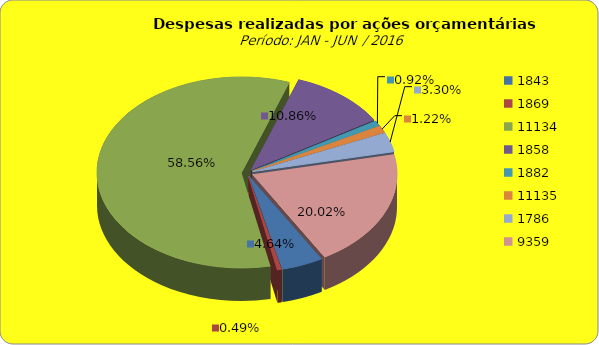
| Category | Series 1 |
|---|---|
| 1843.0 | 5874074.72 |
| 1869.0 | 616053.57 |
| 11134.0 | 74134536.41 |
| 1858.0 | 13753455.4 |
| 1882.0 | 1159155.3 |
| 11135.0 | 1540378.79 |
| 1786.0 | 4175564.84 |
| 9359.0 | 25342545.31 |